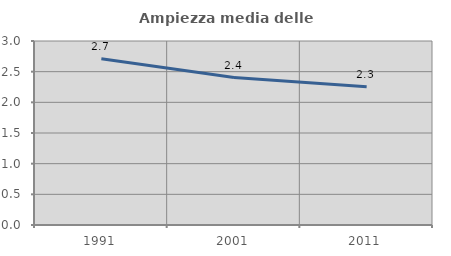
| Category | Ampiezza media delle famiglie |
|---|---|
| 1991.0 | 2.711 |
| 2001.0 | 2.403 |
| 2011.0 | 2.255 |